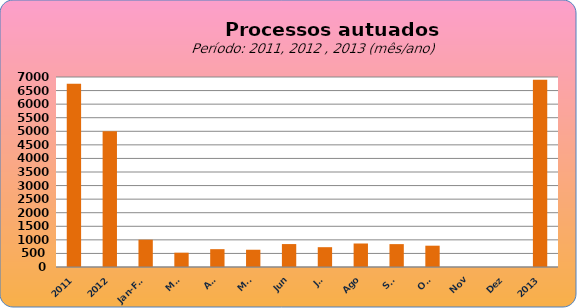
| Category | 6749 4998 1006 527 657 636 845 730 866 843 785 0 0 |
|---|---|
| 2011 | 6749 |
| 2012 | 4998 |
| Jan-Fev | 1006 |
| Mar | 527 |
| Abr | 657 |
| Mai | 636 |
| Jun | 845 |
| Jul | 730 |
| Ago | 866 |
| Set | 843 |
| Out | 785 |
| Nov | 0 |
| Dez | 0 |
| 2013 | 6895 |